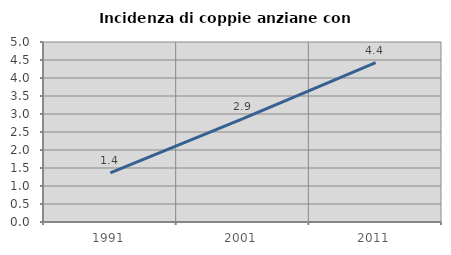
| Category | Incidenza di coppie anziane con figli |
|---|---|
| 1991.0 | 1.364 |
| 2001.0 | 2.869 |
| 2011.0 | 4.425 |